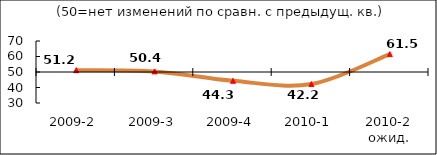
| Category | Диф.индекс ↓ |
|---|---|
| 2009-2 | 51.18 |
| 2009-3 | 50.375 |
| 2009-4 | 44.335 |
| 2010-1 | 42.22 |
| 2010-2 ожид. | 61.535 |